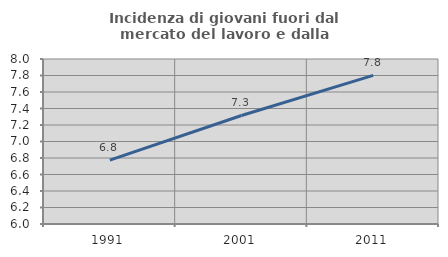
| Category | Incidenza di giovani fuori dal mercato del lavoro e dalla formazione  |
|---|---|
| 1991.0 | 6.774 |
| 2001.0 | 7.315 |
| 2011.0 | 7.802 |